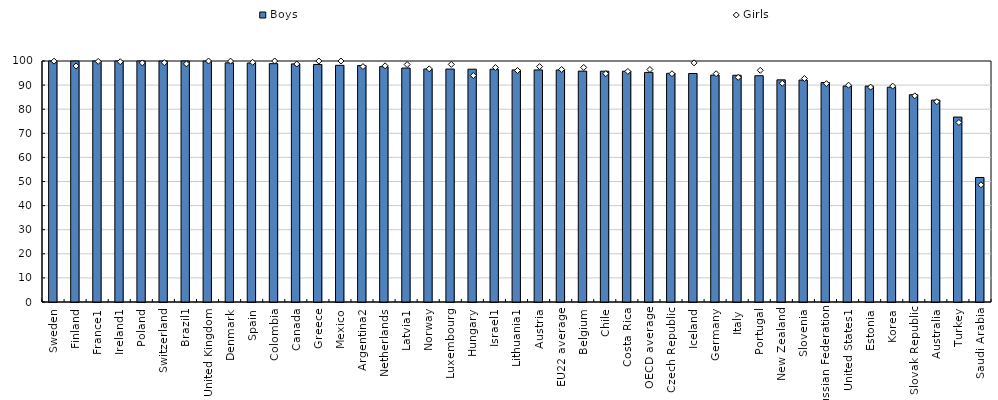
| Category | Boys |
|---|---|
| Sweden | 100 |
| Finland | 100 |
| France1 | 100 |
| Ireland1 | 100 |
| Poland | 100 |
| Switzerland | 100 |
| Brazil1 | 100 |
| United Kingdom | 99.955 |
| Denmark | 99.239 |
| Spain | 99.156 |
| Colombia | 98.896 |
| Canada | 98.796 |
| Greece | 98.56 |
| Mexico | 98.199 |
| Argentina2 | 98.14 |
| Netherlands | 97.655 |
| Latvia1 | 97.082 |
| Norway | 96.681 |
| Luxembourg | 96.664 |
| Hungary | 96.598 |
| Israel1 | 96.584 |
| Lithuania1 | 96.304 |
| Austria | 96.303 |
| EU22 average | 96.277 |
| Belgium | 95.803 |
| Chile | 95.779 |
| Costa Rica | 95.774 |
| OECD average | 95.27 |
| Czech Republic | 94.89 |
| Iceland | 94.807 |
| Germany | 94.151 |
| Italy | 94.081 |
| Portugal | 93.888 |
| New Zealand | 92.177 |
| Slovenia | 92.087 |
| Russian Federation | 91.057 |
| United States1 | 89.623 |
| Estonia | 89.606 |
| Korea | 89.114 |
| Slovak Republic | 86.019 |
| Australia | 83.785 |
| Turkey | 76.744 |
| Saudi Arabia | 51.66 |